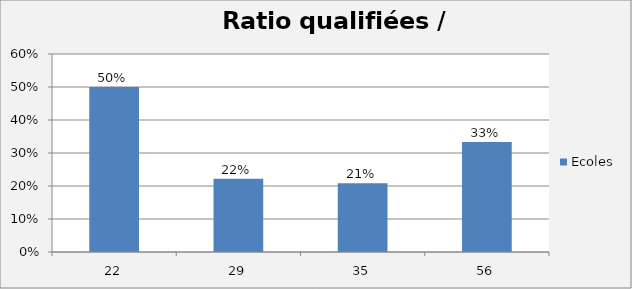
| Category | Ecoles |
|---|---|
| 22.0 | 0.5 |
| 29.0 | 0.222 |
| 35.0 | 0.208 |
| 56.0 | 0.333 |